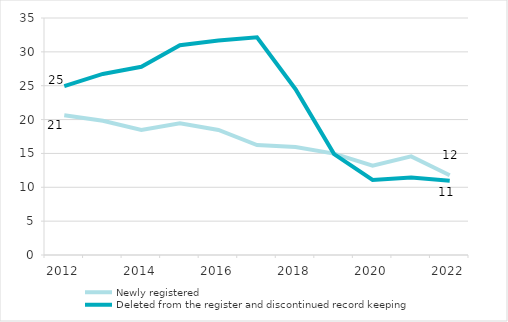
| Category | Newly registered | Deleted from the register and discontinued record keeping |
|---|---|---|
| 2012.0 | 20.629 | 24.928 |
| 2013.0 | 19.833 | 26.742 |
| 2014.0 | 18.475 | 27.788 |
| 2015.0 | 19.468 | 30.98 |
| 2016.0 | 18.469 | 31.67 |
| 2017.0 | 16.227 | 32.158 |
| 2018.0 | 15.939 | 24.483 |
| 2019.0 | 14.973 | 14.898 |
| 2020.0 | 13.18 | 11.087 |
| 2021.0 | 14.564 | 11.432 |
| 2022.0 | 11.785 | 10.954 |